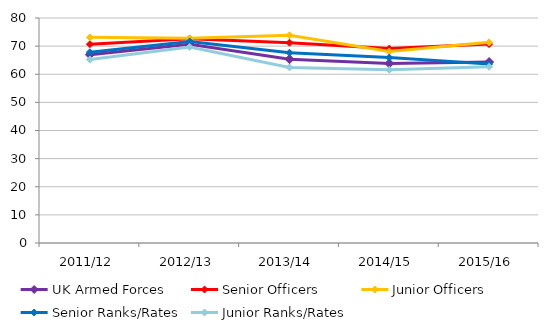
| Category | UK Armed Forces | Senior Officers | Junior Officers | Senior Ranks/Rates | Junior Ranks/Rates |
|---|---|---|---|---|---|
| 2011/12 | 66.956 | 70.695 | 73.113 | 67.85 | 65.238 |
| 2012/13 | 70.664 | 72.665 | 72.761 | 71.672 | 69.692 |
| 2013/14 | 65.34 | 71.2 | 73.852 | 67.655 | 62.413 |
| 2014/15 | 63.833 | 69.113 | 68.069 | 65.927 | 61.611 |
| 2015/16 | 64.352 | 70.716 | 71.34 | 63.607 | 62.659 |